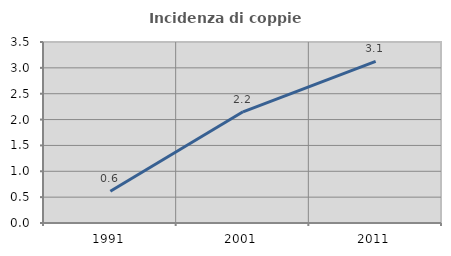
| Category | Incidenza di coppie miste |
|---|---|
| 1991.0 | 0.615 |
| 2001.0 | 2.151 |
| 2011.0 | 3.125 |